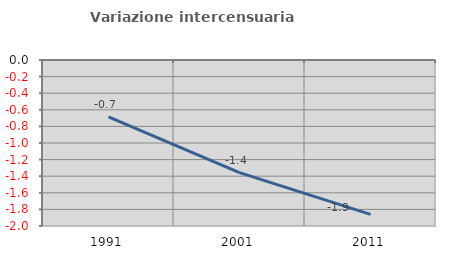
| Category | Variazione intercensuaria annua |
|---|---|
| 1991.0 | -0.686 |
| 2001.0 | -1.356 |
| 2011.0 | -1.86 |